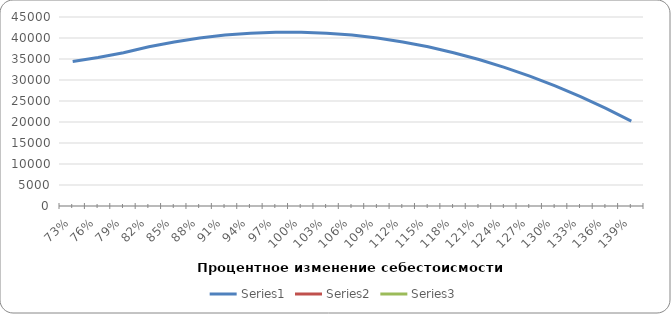
| Category | Series 0 | Series 1 | Series 2 |
|---|---|---|---|
| 0.73 | 34410 | 0 | 0 |
| 0.76 | 35340 | 0 | 0 |
| 0.79 | 36502.5 | 0 | 0 |
| 0.82 | 37897.5 | 0 | 0 |
| 0.85 | 39060 | 0 | 0 |
| 0.88 | 39990 | 0 | 0 |
| 0.91 | 40687.5 | 0 | 0 |
| 0.94 | 41152.5 | 0 | 0 |
| 0.97 | 41385 | 0 | 0 |
| 1.0 | 41385 | 0 | 0 |
| 1.03 | 41152.5 | 0 | 0 |
| 1.06 | 40687.5 | 0 | 0 |
| 1.09 | 39990 | 0 | 0 |
| 1.12 | 39060 | 0 | 0 |
| 1.15 | 37897.5 | 0 | 0 |
| 1.18 | 36502.5 | 0 | 0 |
| 1.21 | 34875 | 0 | 0 |
| 1.24 | 33015 | 0 | 0 |
| 1.27 | 30922.5 | 0 | 0 |
| 1.3 | 28597.5 | 0 | 0 |
| 1.33 | 26040 | 0 | 0 |
| 1.36 | 23250 | 0 | 0 |
| 1.39 | 20227.5 | 0 | 0 |